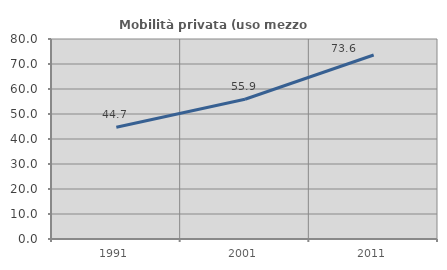
| Category | Mobilità privata (uso mezzo privato) |
|---|---|
| 1991.0 | 44.687 |
| 2001.0 | 55.89 |
| 2011.0 | 73.6 |